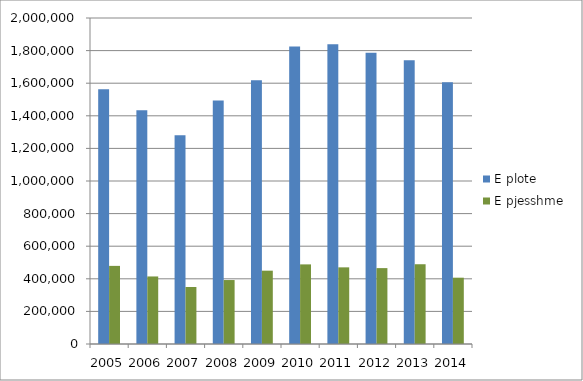
| Category | E plote | E pjesshme |
|---|---|---|
| 2005.0 | 1562464 | 479270 |
| 2006.0 | 1433492 | 414375 |
| 2007.0 | 1281241 | 349675 |
| 2008.0 | 1493166 | 392400 |
| 2009.0 | 1617783 | 449883 |
| 2010.0 | 1825566 | 488400 |
| 2011.0 | 1839394 | 470233 |
| 2012.0 | 1786192 | 465583 |
| 2013.0 | 1740650 | 489342 |
| 2014.0 | 1606425 | 406800 |